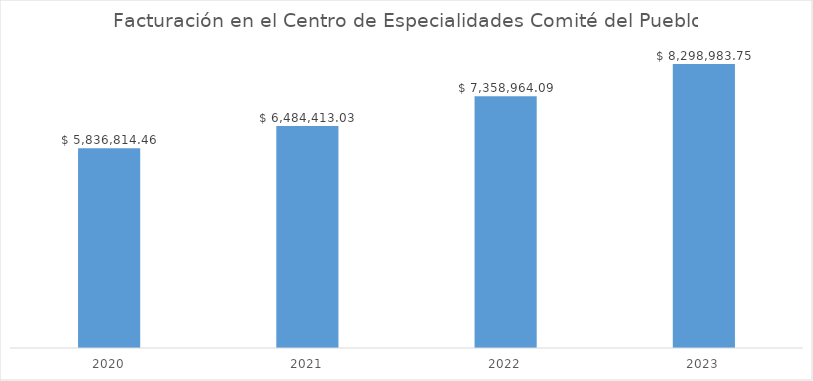
| Category | Valor facturado |
|---|---|
| 2020.0 | 5836814.46 |
| 2021.0 | 6484413.03 |
| 2022.0 | 7358964.09 |
| 2023.0 | 8298983.75 |